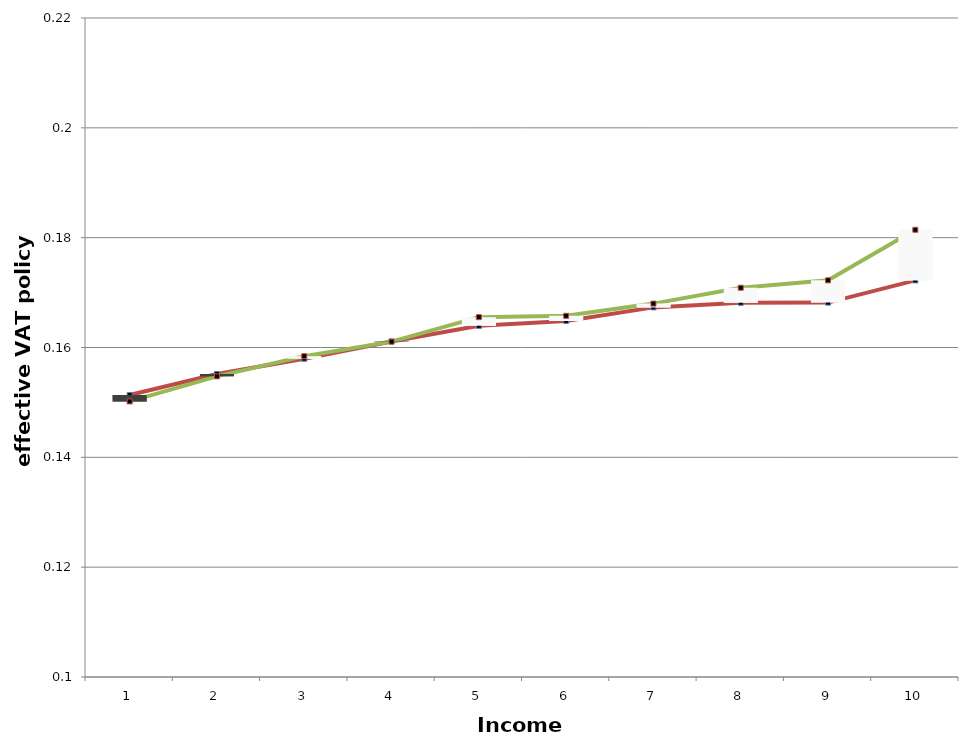
| Category | Series 0 | Series 1 | Series 2 | Series 3 |
|---|---|---|---|---|
| 0 | 0.151 | 0.15 |  |  |
| 1 | 0.155 | 0.155 |  |  |
| 2 | 0.158 | 0.158 |  |  |
| 3 | 0.161 | 0.161 |  |  |
| 4 | 0.164 | 0.166 |  |  |
| 5 | 0.165 | 0.166 |  |  |
| 6 | 0.167 | 0.168 |  |  |
| 7 | 0.168 | 0.171 |  |  |
| 8 | 0.168 | 0.172 |  |  |
| 9 | 0.172 | 0.181 |  |  |